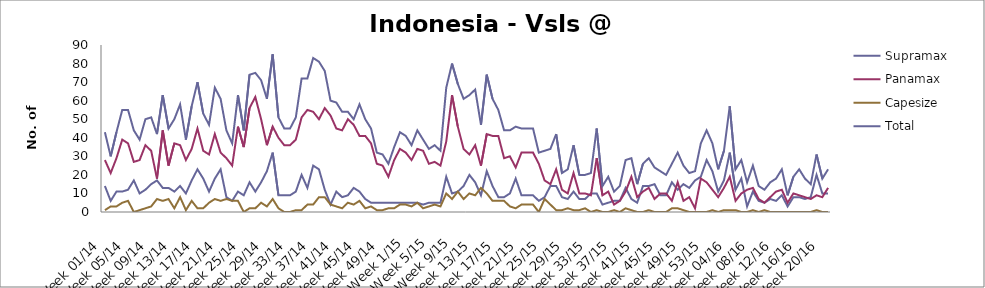
| Category | Supramax | Panamax | Capesize | Total |
|---|---|---|---|---|
| Week 01/14 | 14 | 28 | 1 | 43 |
| Week 02/14 | 6 | 21 | 3 | 30 |
| Week 03/14 | 11 | 29 | 3 | 43 |
| Week 04/14 | 11 | 39 | 5 | 55 |
| Week 05/14 | 12 | 37 | 6 | 55 |
| Week 06/14 | 17 | 27 | 0 | 44 |
| Week 07/14 | 10 | 28 | 1 | 39 |
| Week 08/14 | 12 | 36 | 2 | 50 |
| Week 09/14 | 15 | 33 | 3 | 51 |
| Week 10/14 | 17 | 18 | 7 | 42 |
| Week 11/14 | 13 | 44 | 6 | 63 |
| Week 12/14 | 13 | 25 | 7 | 45 |
| Week 13/14 | 11 | 37 | 2 | 50 |
| Week 14/14 | 14 | 36 | 8 | 58 |
| Week 15/14 | 10 | 28 | 1 | 39 |
| Week 16/14 | 17 | 34 | 6 | 57 |
| Week 17/14 | 23 | 45 | 2 | 70 |
| Week 18/14 | 18 | 33 | 2 | 53 |
| Week 19/14 | 11 | 31 | 5 | 47 |
| Week 20/14 | 18 | 42 | 7 | 67 |
| Week 21/14 | 23 | 32 | 6 | 61 |
| Week 22/14 | 8 | 29 | 7 | 44 |
| Week 23/14 | 6 | 25 | 6 | 37 |
| Week 24/14 | 11 | 46 | 6 | 63 |
| Week 25/14 | 9 | 35 | 0 | 44 |
| Week 26/14 | 16 | 56 | 2 | 74 |
| Week 27/14 | 11 | 62 | 2 | 75 |
| Week 28/14 | 16 | 50 | 5 | 71 |
| Week 29/14 | 22 | 36 | 3 | 61 |
| Week 30/14 | 32 | 46 | 7 | 85 |
| Week 31/14 | 9 | 40 | 2 | 51 |
| Week 32/14 | 9 | 36 | 0 | 45 |
| Week 33/14 | 9 | 36 | 0 | 45 |
| Week 34/14 | 11 | 39 | 1 | 51 |
| Week 35/14 | 20 | 51 | 1 | 72 |
| Week 36/14 | 13 | 55 | 4 | 72 |
| Week 37/14 | 25 | 54 | 4 | 83 |
| Week 38/14 | 23 | 50 | 8 | 81 |
| Week 39/14 | 12 | 56 | 8 | 76 |
| Week 40/14 | 4 | 52 | 4 | 60 |
| Week 41/14 | 11 | 45 | 3 | 59 |
| Week 42/14 | 8 | 44 | 2 | 54 |
| Week 43/14 | 9 | 50 | 5 | 54 |
| Week 44/14 | 13 | 47 | 4 | 50 |
| Week 45/14 | 11 | 41 | 6 | 58 |
| Week 46/14 | 7 | 41 | 2 | 50 |
| Week 47/14 | 5 | 37 | 3 | 45 |
| Week 48/14 | 5 | 26 | 1 | 32 |
| Week 49/14 | 5 | 25 | 1 | 31 |
| Week 50/14 | 5 | 19 | 2 | 26 |
| Week 51/14 | 5 | 28 | 2 | 35 |
| Week 52/14 | 5 | 34 | 4 | 43 |
| Week 1/15 | 5 | 32 | 4 | 41 |
| Week 2/15 | 5 | 28 | 3 | 36 |
| Week 3/15 | 5 | 34 | 5 | 44 |
| Week 4/15 | 4 | 33 | 2 | 39 |
| Week 5/15 | 5 | 26 | 3 | 34 |
| Week 6/15 | 5 | 27 | 4 | 36 |
| Week 7/15 | 5 | 25 | 3 | 33 |
| Week 8/15 | 19 | 38 | 10 | 67 |
| Week 9/15 | 10 | 63 | 7 | 80 |
| Week 10/15 | 11 | 46 | 11 | 69 |
| Week 11/15 | 14 | 34 | 7 | 61 |
| Week 12/15 | 20 | 31 | 10 | 63 |
| Week 13/15 | 16 | 36 | 9 | 66 |
| Week 14/15 | 9 | 25 | 13 | 47 |
| Week 15/15 | 22 | 42 | 10 | 74 |
| Week 16/15 | 14 | 41 | 6 | 61 |
| Week 17/15 | 8 | 41 | 6 | 55 |
| Week 18/15 | 8 | 29 | 6 | 44 |
| Week 19/15 | 10 | 30 | 3 | 44 |
| Week 20/15 | 18 | 24 | 2 | 46 |
| Week 21/15 | 9 | 32 | 4 | 45 |
| Week 22/15 | 9 | 32 | 4 | 45 |
| Week 23/15 | 9 | 32 | 4 | 45 |
| Week 24/15 | 6 | 26 | 0 | 32 |
| Week 25/15 | 8 | 17 | 7 | 33 |
| Week 26/15 | 14 | 15 | 4 | 34 |
| Week 27/15 | 14 | 23 | 1 | 42 |
| Week 28/15 | 8 | 12 | 1 | 21 |
| Week 29/15 | 7 | 10 | 2 | 23 |
| Week 30/15 | 11 | 21 | 1 | 36 |
| Week 31/15 | 7 | 10 | 1 | 20 |
| Week 32/15 | 7 | 10 | 2 | 20 |
| Week 33/15 | 10 | 9 | 0 | 21 |
| Week 34/15 | 10 | 29 | 1 | 45 |
| Week 35/15 | 4 | 9 | 0 | 14 |
| Week 36/15 | 5 | 11 | 0 | 19 |
| Week 37/15 | 6 | 4 | 1 | 11 |
| Week 38/15 | 6 | 6 | 0 | 14 |
| Week 39/15 | 13 | 11 | 2 | 28 |
| Week 40/15 | 7 | 19 | 1 | 29 |
| Week 41/15 | 5 | 8 | 0 | 15 |
| Week 42/15 | 14 | 11 | 0 | 26 |
| Week 43/15 | 14 | 13 | 1 | 29 |
| Week 44/15 | 15 | 7 | 0 | 24 |
| Week 45/15 | 9 | 10 | 0 | 22 |
| Week 46/15 | 9 | 10 | 0 | 20 |
| Week 47/15 | 16 | 6 | 2 | 26 |
| Week 48/15 | 12 | 16 | 2 | 32 |
| Week 49/15 | 15 | 6 | 1 | 25 |
| Week 50/15 | 13 | 8 | 0 | 21 |
| Week 51/15 | 17 | 2 | 0 | 22 |
| Week 52/15 | 19 | 18 | 0 | 37 |
| Week 53/15 | 28 | 16 | 0 | 44 |
| Week 01/16 | 22 | 12 | 1 | 37 |
| Week 02/16 | 11 | 8 | 0 | 23 |
| Week 03/16 | 17 | 13 | 1 | 33 |
| Week 04/16 | 32 | 19 | 1 | 57 |
| Week 05/16 | 12 | 6 | 1 | 23 |
| Week 06/16 | 18 | 10 | 0 | 28 |
| Week 07/16 | 3 | 12 | 0 | 16 |
| Week 08/16 | 11 | 13 | 1 | 25 |
| Week 09/16 | 6 | 7 | 0 | 14 |
| Week 10/16 | 5 | 5 | 1 | 12 |
| Week 11/16 | 7 | 8 | 0 | 16 |
| Week 12/16 | 6 | 11 | 0 | 18 |
| Week 13/16 | 9 | 12 | 0 | 23 |
| Week 14/16 | 3 | 5 | 0 | 9 |
| Week 15/16 | 8 | 10 | 0 | 19 |
| Week 16/16 | 8 | 9 | 0 | 23 |
| Week 17/16 | 7 | 8 | 0 | 18 |
| Week 18/16 | 8 | 7 | 0 | 15 |
| Week 19/16 | 20 | 9 | 1 | 31 |
| Week 20/16 | 10 | 8 | 0 | 18 |
| Week 21/16 | 10 | 13 | 0 | 23 |